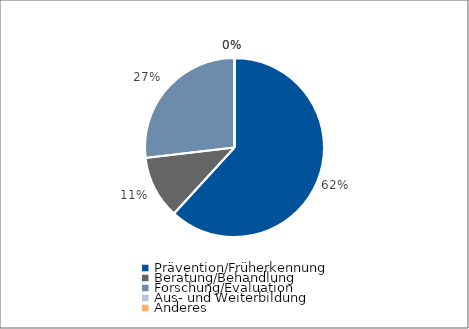
| Category | Series 0 |
|---|---|
| Prävention/Früherkennung | 10900 |
| Beratung/Behandlung | 2000 |
| Forschung/Evaluation | 4736 |
| Aus- und Weiterbildung | 0 |
| Anderes | 0 |